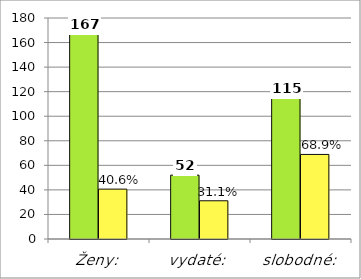
| Category | Series 0 | Series 1 |
|---|---|---|
| Ženy: | 167 | 40.633 |
| vydaté: | 52 | 31.138 |
| slobodné: | 115 | 68.862 |